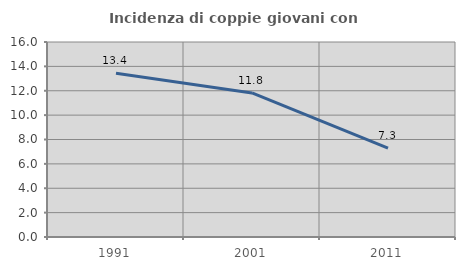
| Category | Incidenza di coppie giovani con figli |
|---|---|
| 1991.0 | 13.431 |
| 2001.0 | 11.821 |
| 2011.0 | 7.284 |